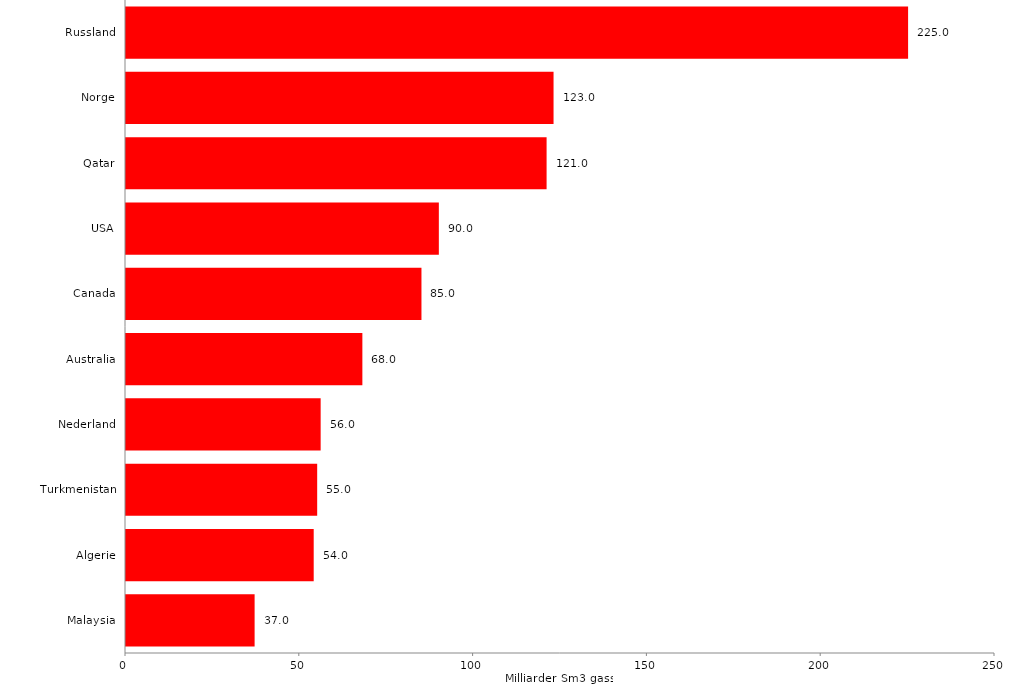
| Category |  37,0  |
|---|---|
| Malaysia | 37 |
| Algerie | 54 |
| Turkmenistan | 55 |
| Nederland | 56 |
| Australia | 68 |
| Canada | 85 |
| USA | 90 |
| Qatar | 121 |
| Norge | 123 |
| Russland | 225 |